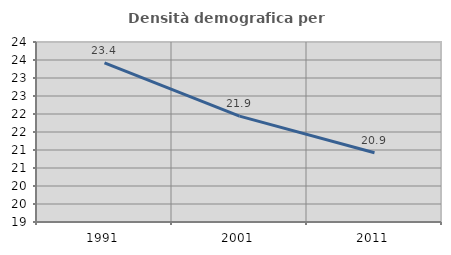
| Category | Densità demografica |
|---|---|
| 1991.0 | 23.419 |
| 2001.0 | 21.94 |
| 2011.0 | 20.924 |